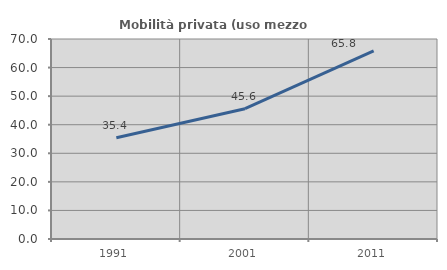
| Category | Mobilità privata (uso mezzo privato) |
|---|---|
| 1991.0 | 35.425 |
| 2001.0 | 45.614 |
| 2011.0 | 65.835 |